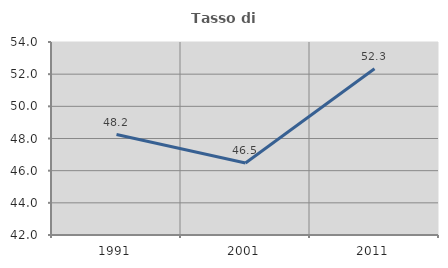
| Category | Tasso di occupazione   |
|---|---|
| 1991.0 | 48.246 |
| 2001.0 | 46.475 |
| 2011.0 | 52.333 |